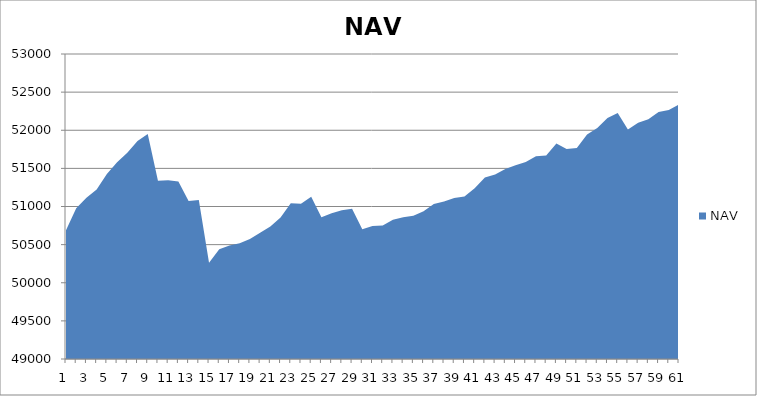
| Category | NAV |
|---|---|
| 0 | 50687.913 |
| 1 | 50975.413 |
| 2 | 51115.874 |
| 3 | 51223.542 |
| 4 | 51427.364 |
| 5 | 51580.567 |
| 6 | 51704.692 |
| 7 | 51858.016 |
| 8 | 51951.766 |
| 9 | 51336.067 |
| 10 | 51345.356 |
| 11 | 51328.667 |
| 12 | 51072.985 |
| 13 | 51085.199 |
| 14 | 50261.67 |
| 15 | 50438.394 |
| 16 | 50489.896 |
| 17 | 50518.251 |
| 18 | 50572.468 |
| 19 | 50655.55 |
| 20 | 50737.787 |
| 21 | 50856.035 |
| 22 | 51041.806 |
| 23 | 51034.925 |
| 24 | 51128.589 |
| 25 | 50859.456 |
| 26 | 50911.137 |
| 27 | 50950.007 |
| 28 | 50970.175 |
| 29 | 50701.326 |
| 30 | 50743.495 |
| 31 | 50751.546 |
| 32 | 50826.725 |
| 33 | 50860.533 |
| 34 | 50879.283 |
| 35 | 50936.644 |
| 36 | 51031.381 |
| 37 | 51065.306 |
| 38 | 51109.987 |
| 39 | 51132.251 |
| 40 | 51238.242 |
| 41 | 51380.786 |
| 42 | 51420.042 |
| 43 | 51490.787 |
| 44 | 51541.14 |
| 45 | 51584.924 |
| 46 | 51657.998 |
| 47 | 51667.348 |
| 48 | 51825.763 |
| 49 | 51755.412 |
| 50 | 51767.57 |
| 51 | 51945.15 |
| 52 | 52028.391 |
| 53 | 52160.744 |
| 54 | 52227.009 |
| 55 | 52009.927 |
| 56 | 52099.094 |
| 57 | 52144.26 |
| 58 | 52240.689 |
| 59 | 52266.163 |
| 60 | 52339.405 |